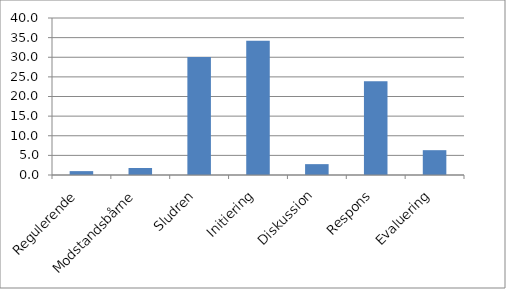
| Category | Series 0 |
|---|---|
| Regulerende | 0.988 |
| Modstandsbårne | 1.779 |
| Sludren | 30.04 |
| Initiering | 34.19 |
| Diskussion | 2.767 |
| Respons | 23.913 |
| Evaluering | 6.324 |